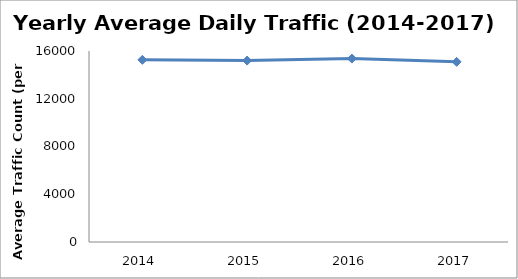
| Category | Series 0 |
|---|---|
| 2014.0 | 15258.775 |
| 2015.0 | 15198.408 |
| 2016.0 | 15365.956 |
| 2017.0 | 15089.4 |